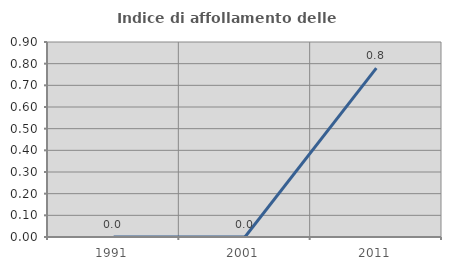
| Category | Indice di affollamento delle abitazioni  |
|---|---|
| 1991.0 | 0 |
| 2001.0 | 0 |
| 2011.0 | 0.779 |